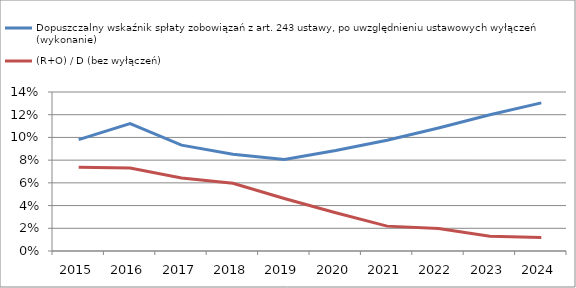
| Category | Dopuszczalny wskaźnik spłaty zobowiązań z art. 243 ustawy, po uwzględnieniu ustawowych wyłączeń (wykonanie)  | (R+O) / D (bez wyłączeń) |
|---|---|---|
| 2015.0 | 0.098 | 0.074 |
| 2016.0 | 0.112 | 0.073 |
| 2017.0 | 0.093 | 0.064 |
| 2018.0 | 0.085 | 0.06 |
| 2019.0 | 0.081 | 0.046 |
| 2020.0 | 0.088 | 0.034 |
| 2021.0 | 0.098 | 0.022 |
| 2022.0 | 0.108 | 0.02 |
| 2023.0 | 0.12 | 0.013 |
| 2024.0 | 0.13 | 0.012 |